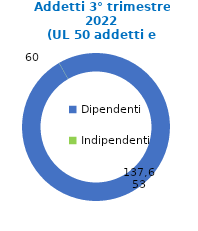
| Category | Series 0 |
|---|---|
| Dipendenti | 137653 |
| Indipendenti | 60 |